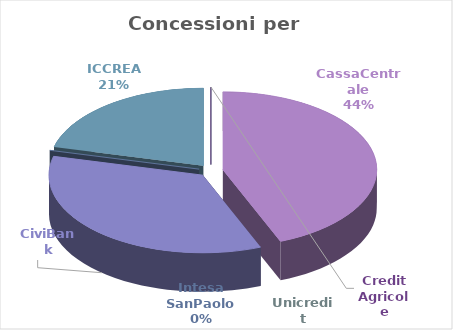
| Category | Series 0 |
|---|---|
| CassaCentrale | 11219000 |
| CiviBank | 8955654 |
| Intesa SanPaolo  | 0 |
| ICCREA | 5393000 |
| BCC Financing | 0 |
| Unicredit | 0 |
| Credit Agricole | 0 |